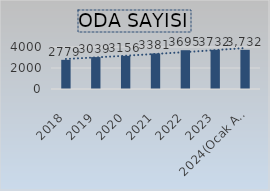
| Category | Series 6 |
|---|---|
| 2018 | 2779 |
| 2019 | 3039 |
| 2020 | 3156 |
| 2021 | 3381 |
| 2022 | 3695 |
| 2023 | 3732 |
| 2024(Ocak Ayı İtibariyle) | 3732 |